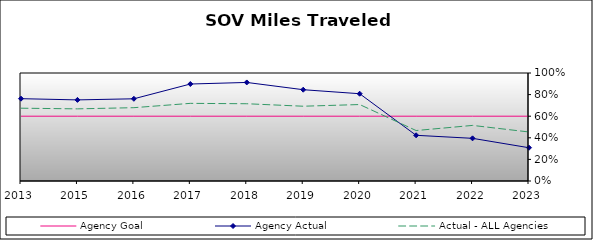
| Category | Agency Goal | Agency Actual | Actual - ALL Agencies |
|---|---|---|---|
| 2013.0 | 0.6 | 0.762 | 0.674 |
| 2015.0 | 0.6 | 0.751 | 0.668 |
| 2016.0 | 0.6 | 0.761 | 0.679 |
| 2017.0 | 0.6 | 0.898 | 0.719 |
| 2018.0 | 0.6 | 0.912 | 0.715 |
| 2019.0 | 0.6 | 0.845 | 0.692 |
| 2020.0 | 0.6 | 0.808 | 0.708 |
| 2021.0 | 0.6 | 0.423 | 0.467 |
| 2022.0 | 0.6 | 0.395 | 0.515 |
| 2023.0 | 0.6 | 0.308 | 0.454 |